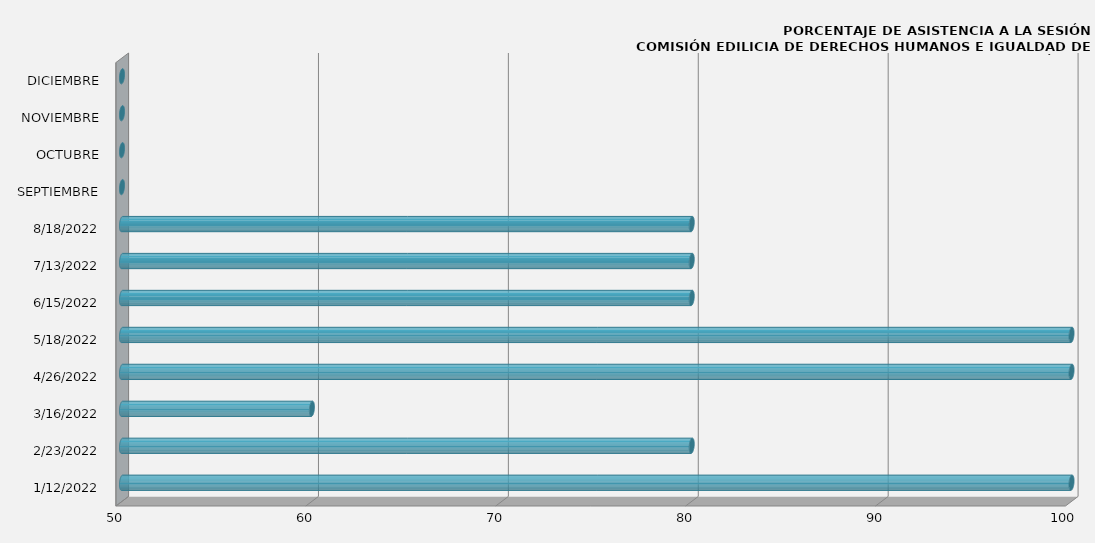
| Category | 12/01/2022 |
|---|---|
| 12/01/2022 | 100 |
| 23/02/2022 | 80 |
| 16/03/2022 | 60 |
| 26/04/2022 | 100 |
| 18/05/2022 | 100 |
| 15/06/2022 | 80 |
| 13/07/2022 | 80 |
| 18/08/2022 | 80 |
| SEPTIEMBRE | 0 |
| OCTUBRE | 0 |
| NOVIEMBRE | 0 |
| DICIEMBRE | 0 |